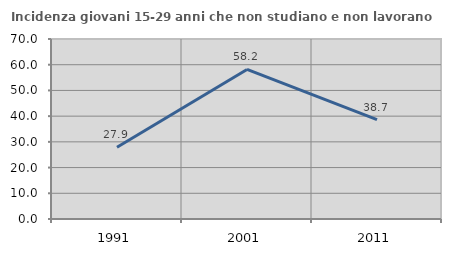
| Category | Incidenza giovani 15-29 anni che non studiano e non lavorano  |
|---|---|
| 1991.0 | 27.906 |
| 2001.0 | 58.157 |
| 2011.0 | 38.682 |